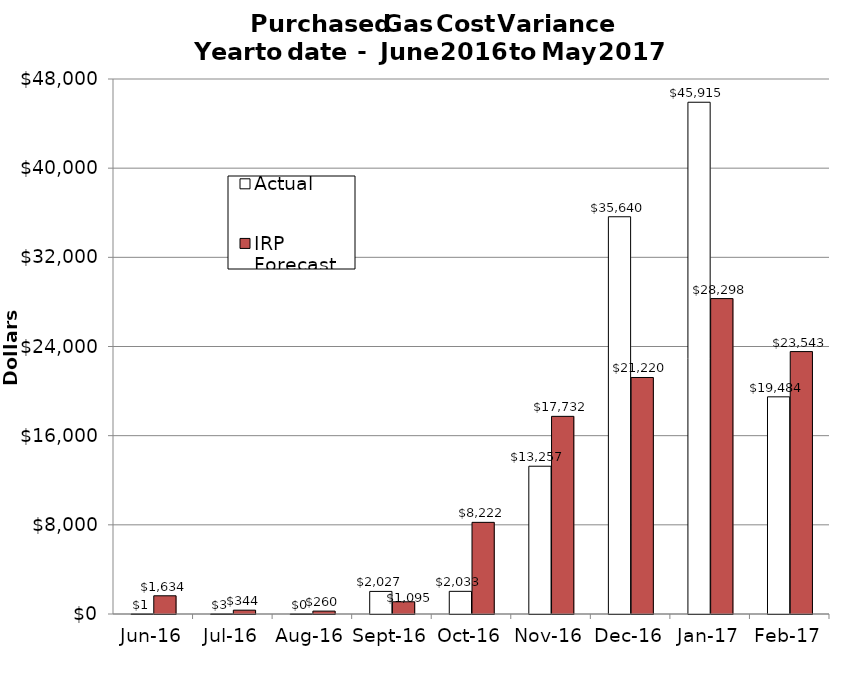
| Category | Actual | IRP Forecast (Normal) |
|---|---|---|
| 2016-06-01 | 0.925 | 1633.98 |
| 2016-07-01 | 2.816 | 343.685 |
| 2016-08-01 | 0.26 | 260.159 |
| 2016-09-01 | 2026.55 | 1095.414 |
| 2016-10-01 | 2032.875 | 8222.07 |
| 2016-11-01 | 13257.49 | 17732.29 |
| 2016-12-01 | 35640.104 | 21219.87 |
| 2017-01-01 | 45914.593 | 28297.5 |
| 2017-02-01 | 19483.684 | 23543.13 |